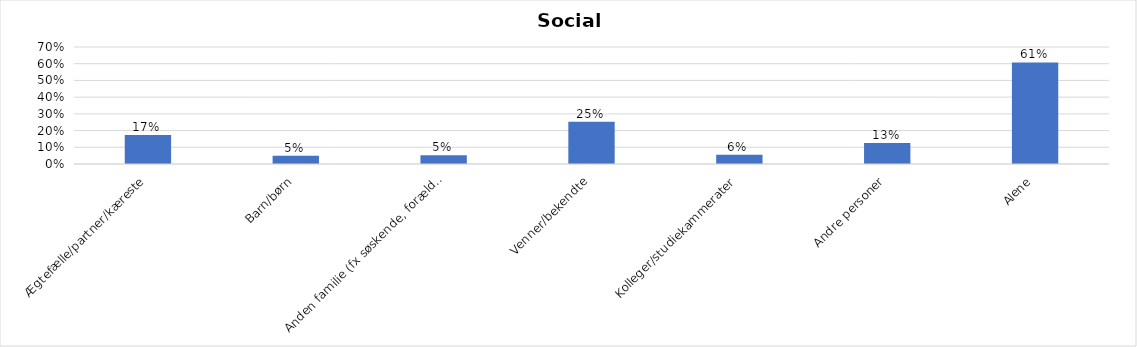
| Category | % |
|---|---|
| Ægtefælle/partner/kæreste | 0.174 |
| Barn/børn | 0.049 |
| Anden familie (fx søskende, forældre) | 0.052 |
| Venner/bekendte | 0.252 |
| Kolleger/studiekammerater | 0.055 |
| Andre personer | 0.125 |
| Alene | 0.608 |